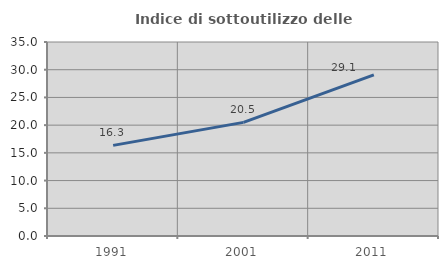
| Category | Indice di sottoutilizzo delle abitazioni  |
|---|---|
| 1991.0 | 16.348 |
| 2001.0 | 20.498 |
| 2011.0 | 29.078 |